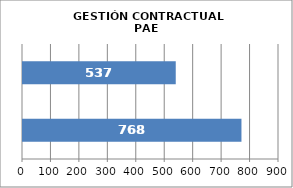
| Category | GESTIÓN CONTRACTUAL PAE |
|---|---|
| # Contratos Programados | 768 |
| # Contratos Suscritos | 537 |